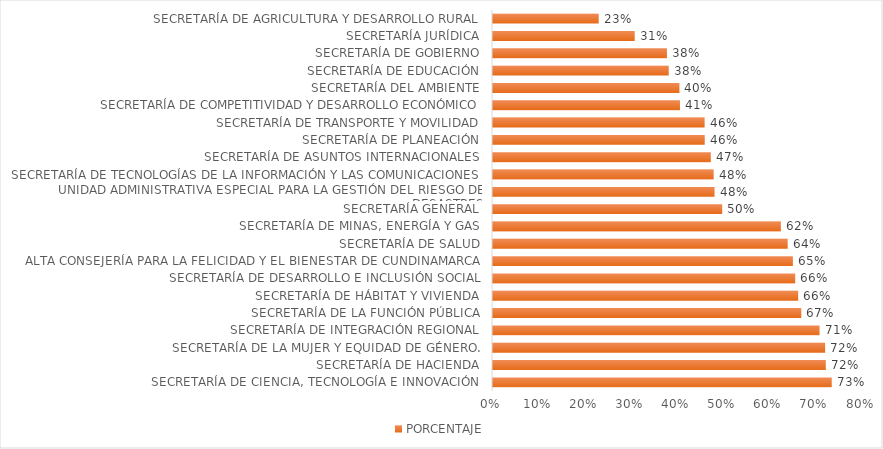
| Category | PORCENTAJE |
|---|---|
| SECRETARÍA DE CIENCIA, TECNOLOGÍA E INNOVACIÓN | 0.734 |
| SECRETARÍA DE HACIENDA | 0.722 |
| SECRETARÍA DE LA MUJER Y EQUIDAD DE GÉNERO. | 0.72 |
| SECRETARÍA DE INTEGRACIÓN REGIONAL | 0.708 |
| SECRETARÍA DE LA FUNCIÓN PÚBLICA | 0.668 |
| SECRETARÍA DE HÁBITAT Y VIVIENDA | 0.662 |
| SECRETARÍA DE DESARROLLO E INCLUSIÓN SOCIAL | 0.655 |
| ALTA CONSEJERÍA PARA LA FELICIDAD Y EL BIENESTAR DE CUNDINAMARCA | 0.65 |
| SECRETARÍA DE SALUD | 0.639 |
| SECRETARÍA DE MINAS, ENERGÍA Y GAS | 0.624 |
| SECRETARÍA GENERAL | 0.497 |
| UNIDAD ADMINISTRATIVA ESPECIAL PARA LA GESTIÓN DEL RIESGO DE DESASTRES | 0.48 |
| SECRETARÍA DE TECNOLOGÍAS DE LA INFORMACIÓN Y LAS COMUNICACIONES | 0.478 |
| SECRETARÍA DE ASUNTOS INTERNACIONALES | 0.472 |
| SECRETARÍA DE PLANEACIÓN | 0.459 |
| SECRETARÍA DE TRANSPORTE Y MOVILIDAD | 0.459 |
| SECRETARÍA DE COMPETITIVIDAD Y DESARROLLO ECONÓMICO | 0.405 |
| SECRETARÍA DEL AMBIENTE | 0.404 |
| SECRETARÍA DE EDUCACIÓN | 0.381 |
| SECRETARÍA DE GOBIERNO | 0.377 |
| SECRETARÍA JURÍDICA | 0.307 |
| SECRETARÍA DE AGRICULTURA Y DESARROLLO RURAL | 0.229 |